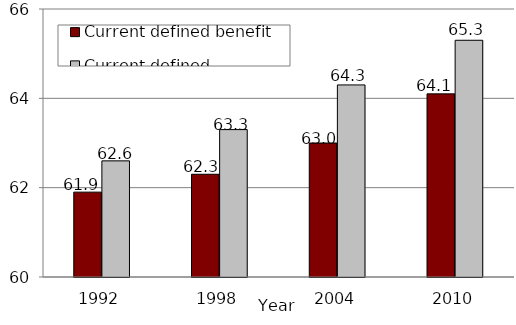
| Category | Current defined benefit | Current defined contribution |
|---|---|---|
| 1992.0 | 61.9 | 62.6 |
| 1998.0 | 62.3 | 63.3 |
| 2004.0 | 63 | 64.3 |
| 2010.0 | 64.1 | 65.3 |